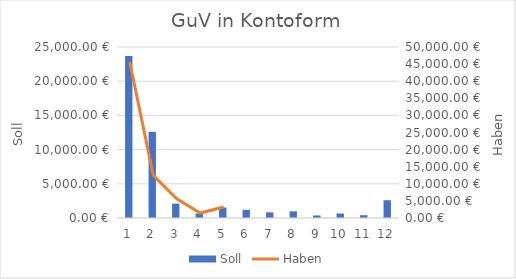
| Category | Soll |
|---|---|
| 0 | 23700 |
| 1 | 12600 |
| 2 | 2100 |
| 3 | 640 |
| 4 | 1540 |
| 5 | 1200 |
| 6 | 830 |
| 7 | 980 |
| 8 | 370 |
| 9 | 650 |
| 10 | 410 |
| 11 | 2600 |